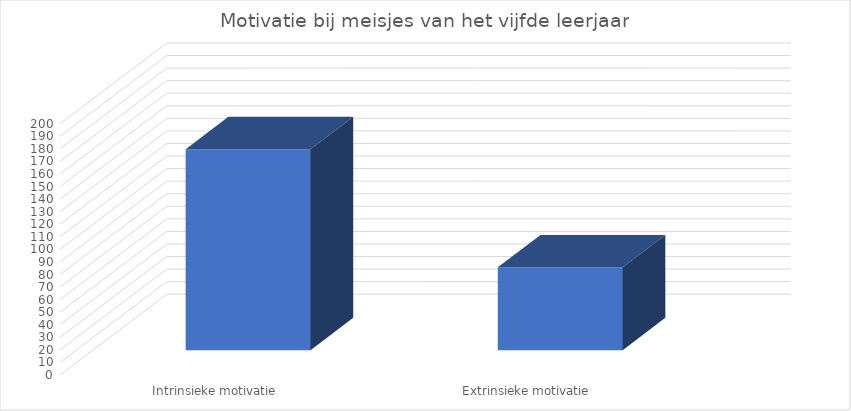
| Category | Series 0 |
|---|---|
| Intrinsieke motivatie | 160 |
| Extrinsieke motivatie | 66 |